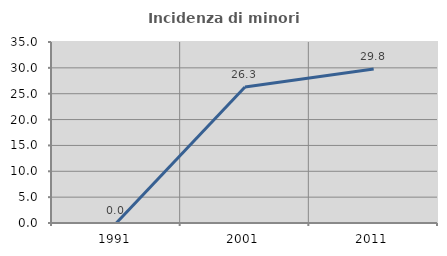
| Category | Incidenza di minori stranieri |
|---|---|
| 1991.0 | 0 |
| 2001.0 | 26.316 |
| 2011.0 | 29.787 |